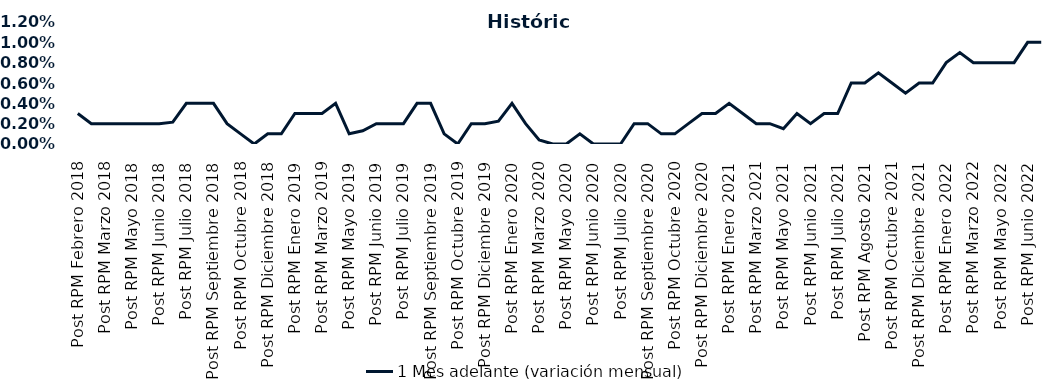
| Category | 1 Mes adelante (variación mensual) |
|---|---|
| Post RPM Febrero 2018 | 0.003 |
| Pre RPM Marzo 2018 | 0.002 |
| Post RPM Marzo 2018 | 0.002 |
| Pre RPM Mayo 2018 | 0.002 |
| Post RPM Mayo 2018 | 0.002 |
| Pre RPM Junio 2018 | 0.002 |
| Post RPM Junio 2018 | 0.002 |
| Pre RPM Julio 2018 | 0.002 |
| Post RPM Julio 2018 | 0.004 |
| Pre RPM Septiembre 2018 | 0.004 |
| Post RPM Septiembre 2018 | 0.004 |
| Pre RPM Octubre 2018 | 0.002 |
| Post RPM Octubre 2018 | 0.001 |
| Pre RPM Diciembre 2018 | 0 |
| Post RPM Diciembre 2018 | 0.001 |
| Pre RPM Enero 2019 | 0.001 |
| Post RPM Enero 2019 | 0.003 |
| Pre RPM Marzo 2019 | 0.003 |
| Post RPM Marzo 2019 | 0.003 |
| Pre RPM Mayo 2019 | 0.004 |
| Post RPM Mayo 2019 | 0.001 |
| Pre RPM Junio 2019 | 0.001 |
| Post RPM Junio 2019 | 0.002 |
| Pre RPM Julio 2019 | 0.002 |
| Post RPM Julio 2019 | 0.002 |
| Pre RPM Septiembre 2019 | 0.004 |
| Post RPM Septiembre 2019 | 0.004 |
| Pre RPM Octubre 2019 | 0.001 |
| Post RPM Octubre 2019 | 0 |
| Pre RPM Diciembre 2019 | 0.002 |
| Post RPM Diciembre 2019 | 0.002 |
| Pre RPM Enero 2020 | 0.002 |
| Post RPM Enero 2020 | 0.004 |
| Pre RPM Marzo 2020 | 0.002 |
| Post RPM Marzo 2020 | 0 |
| Pre RPM Mayo 2020 | 0 |
| Post RPM Mayo 2020 | 0 |
| Pre RPM Junio 2020 | 0.001 |
| Post RPM Junio 2020 | 0 |
| Pre RPM Julio 2020 | 0 |
| Post RPM Julio 2020 | 0 |
| Pre RPM Septiembre 2020 | 0.002 |
| Post RPM Septiembre 2020 | 0.002 |
| Pre RPM Octubre 2020 | 0.001 |
| Post RPM Octubre 2020 | 0.001 |
| Pre RPM Diciembre 2020 | 0.002 |
| Post RPM Diciembre 2020 | 0.003 |
| Pre RPM Enero 2021 | 0.003 |
| Post RPM Enero 2021 | 0.004 |
| Pre RPM Marzo 2021 | 0.003 |
| Post RPM Marzo 2021 | 0.002 |
| Pre RPM Mayo 2021 | 0.002 |
| Post RPM Mayo 2021 | 0.002 |
| Pre RPM Junio 2021 | 0.003 |
| Post RPM Junio 2021 | 0.002 |
| Pre RPM Julio 2021 | 0.003 |
| Post RPM Julio 2021 | 0.003 |
| Pre RPM Agosto 2021 | 0.006 |
| Post RPM Agosto 2021 | 0.006 |
| Pre RPM Octubre 2021 | 0.007 |
| Post RPM Octubre 2021 | 0.006 |
| Pre RPM Diciembre 2021 | 0.005 |
| Post RPM Diciembre 2021 | 0.006 |
| Pre RPM Enero 2022 | 0.006 |
| Post RPM Enero 2022 | 0.008 |
| Pre RPM Marzo 2022 | 0.009 |
| Post RPM Marzo 2022 | 0.008 |
| Pre RPM Mayo 2022 | 0.008 |
| Post RPM Mayo 2022 | 0.008 |
| Pre RPM Junio 2022 | 0.008 |
| Post RPM Junio 2022 | 0.01 |
| Pre RPM Julio 2022 | 0.01 |